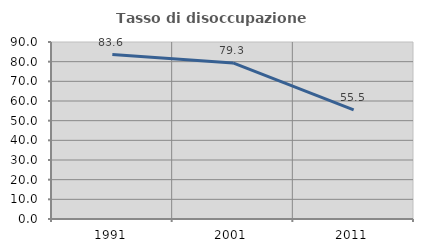
| Category | Tasso di disoccupazione giovanile  |
|---|---|
| 1991.0 | 83.597 |
| 2001.0 | 79.348 |
| 2011.0 | 55.471 |